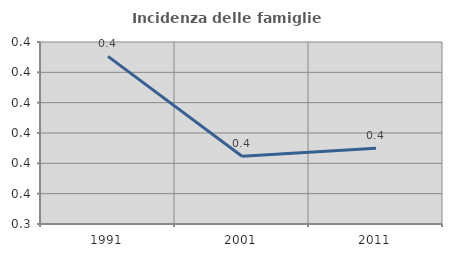
| Category | Incidenza delle famiglie numerose |
|---|---|
| 1991.0 | 0.395 |
| 2001.0 | 0.362 |
| 2011.0 | 0.365 |